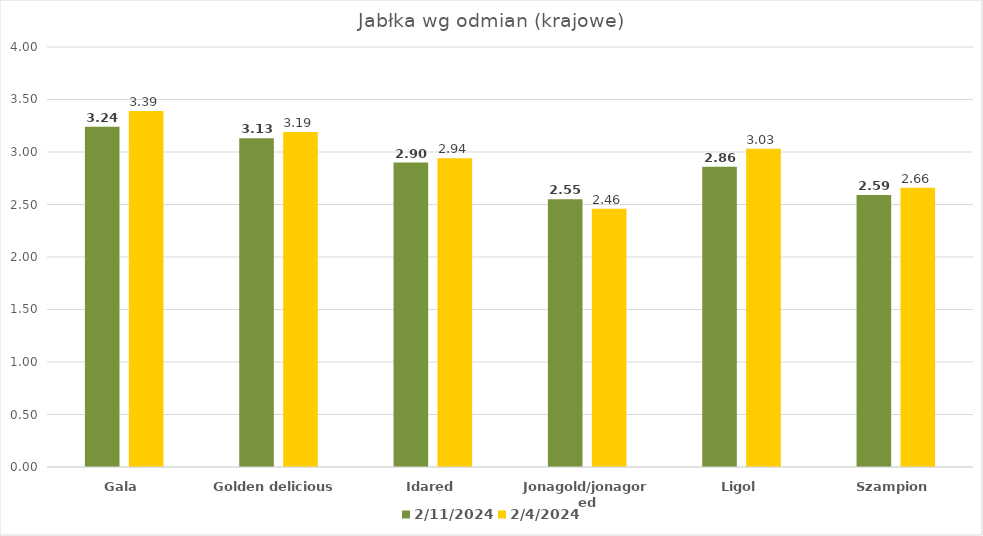
| Category | 11.02.2024 | 04.02.2024 |
|---|---|---|
| Gala | 3.24 | 3.39 |
| Golden delicious | 3.13 | 3.19 |
| Idared | 2.9 | 2.94 |
| Jonagold/jonagored | 2.55 | 2.46 |
| Ligol | 2.86 | 3.03 |
| Szampion | 2.59 | 2.66 |